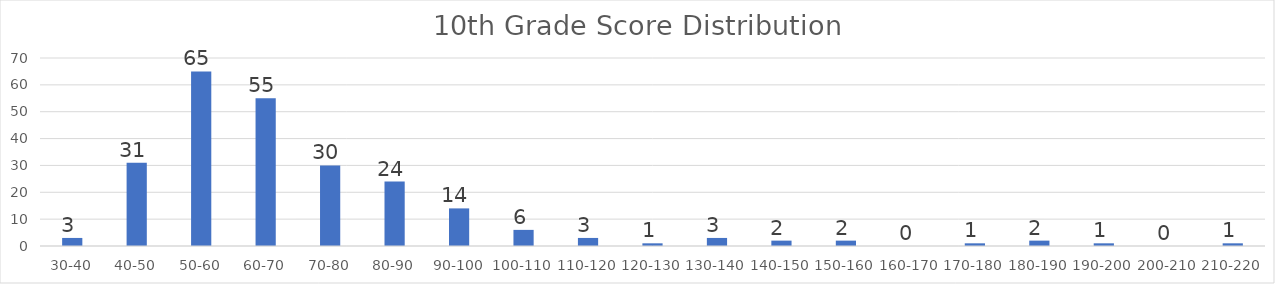
| Category | Series 0 |
|---|---|
| 30-40 | 3 |
| 40-50 | 31 |
| 50-60 | 65 |
| 60-70 | 55 |
| 70-80 | 30 |
| 80-90 | 24 |
| 90-100 | 14 |
| 100-110 | 6 |
| 110-120 | 3 |
| 120-130 | 1 |
| 130-140 | 3 |
| 140-150 | 2 |
| 150-160 | 2 |
| 160-170 | 0 |
| 170-180 | 1 |
| 180-190 | 2 |
| 190-200 | 1 |
| 200-210 | 0 |
| 210-220 | 1 |